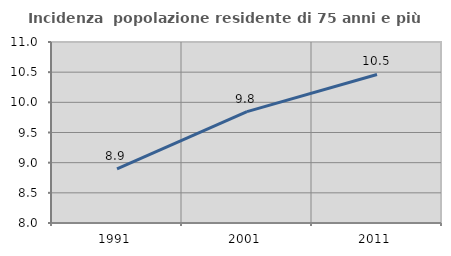
| Category | Incidenza  popolazione residente di 75 anni e più |
|---|---|
| 1991.0 | 8.898 |
| 2001.0 | 9.847 |
| 2011.0 | 10.462 |